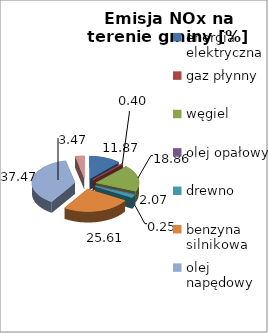
| Category | energia elektryczna gaz płynny węgiel olej opałowy drewno benzyna silnikowa olej napędowy LPG Transport |
|---|---|
| energia elektryczna | 11.867 |
| gaz płynny | 0.399 |
| węgiel | 18.857 |
| olej opałowy | 0.255 |
| drewno | 2.07 |
| benzyna silnikowa | 25.608 |
| olej napędowy | 37.475 |
| LPG Transport | 3.47 |